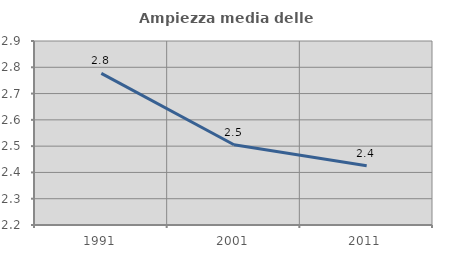
| Category | Ampiezza media delle famiglie |
|---|---|
| 1991.0 | 2.777 |
| 2001.0 | 2.505 |
| 2011.0 | 2.425 |